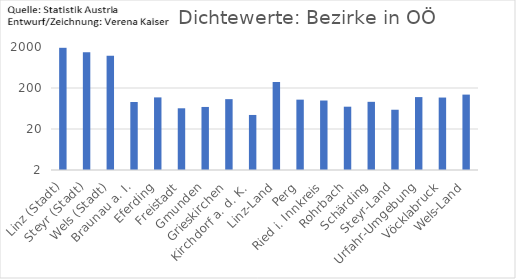
| Category | Dichte |
|---|---|
| Linz (Stadt) | 1912 |
| Steyr (Stadt) | 1481 |
| Wels (Stadt) | 1230 |
| Braunau a. I. | 91 |
| Eferding | 118 |
| Freistadt | 64 |
| Gmunden | 69 |
| Grieskirchen | 107 |
| Kirchdorf a. d. K.  | 44 |
| Linz-Land | 280 |
| Perg | 104 |
| Ried i. Innkreis | 99 |
| Rohrbach | 70 |
| Schärding | 92 |
| Steyr-Land | 59 |
| Urfahr-Umgebung | 120 |
| Vöcklabruck | 117 |
| Wels-Land | 138 |